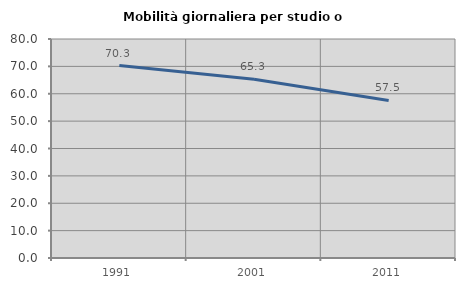
| Category | Mobilità giornaliera per studio o lavoro |
|---|---|
| 1991.0 | 70.286 |
| 2001.0 | 65.278 |
| 2011.0 | 57.55 |